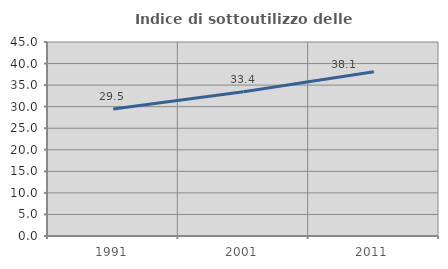
| Category | Indice di sottoutilizzo delle abitazioni  |
|---|---|
| 1991.0 | 29.459 |
| 2001.0 | 33.447 |
| 2011.0 | 38.101 |